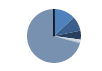
| Category | Series 0 |
|---|---|
| ARRASTRE | 126 |
| CERCO | 85 |
| PALANGRE | 52 |
| REDES DE ENMALLE | 14 |
| ARTES FIJAS | 8 |
| ARTES MENORES | 682 |
| SIN TIPO ASIGNADO | 1 |